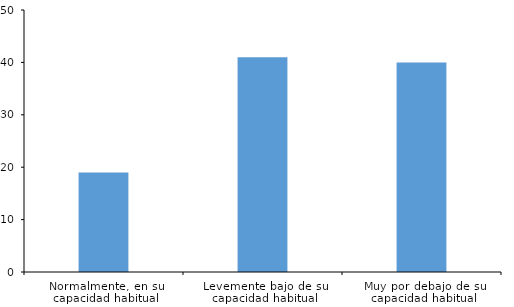
| Category | Series 0 |
|---|---|
| Normalmente, en su capacidad habitual | 19 |
| Levemente bajo de su capacidad habitual | 41 |
| Muy por debajo de su capacidad habitual | 40 |